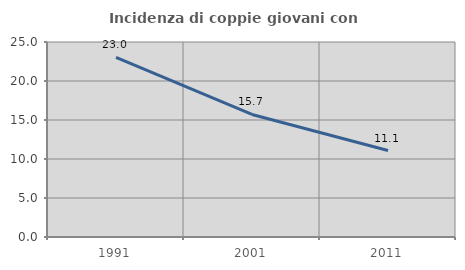
| Category | Incidenza di coppie giovani con figli |
|---|---|
| 1991.0 | 23.04 |
| 2001.0 | 15.713 |
| 2011.0 | 11.086 |